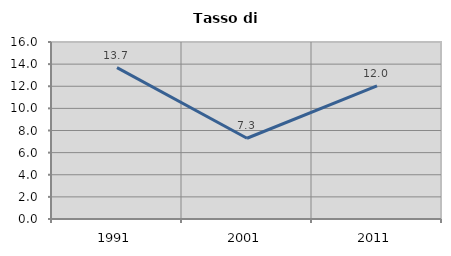
| Category | Tasso di disoccupazione   |
|---|---|
| 1991.0 | 13.685 |
| 2001.0 | 7.3 |
| 2011.0 | 12.03 |